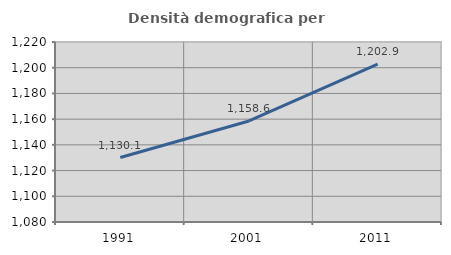
| Category | Densità demografica |
|---|---|
| 1991.0 | 1130.128 |
| 2001.0 | 1158.56 |
| 2011.0 | 1202.865 |